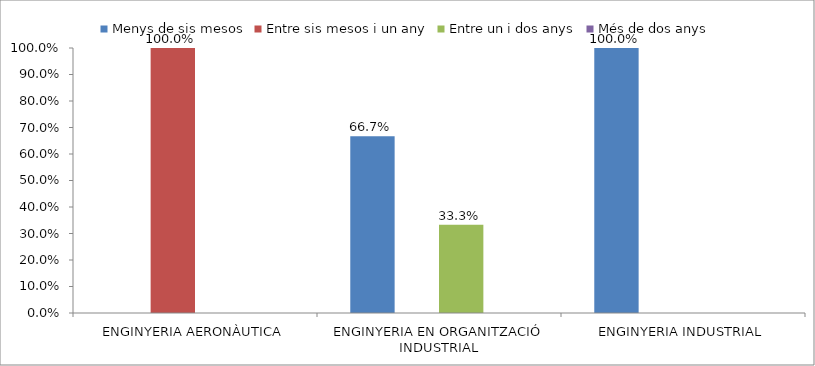
| Category | Menys de sis mesos | Entre sis mesos i un any | Entre un i dos anys | Més de dos anys |
|---|---|---|---|---|
| ENGINYERIA AERONÀUTICA | 0 | 1 | 0 | 0 |
| ENGINYERIA EN ORGANITZACIÓ INDUSTRIAL | 0.667 | 0 | 0.333 | 0 |
| ENGINYERIA INDUSTRIAL | 1 | 0 | 0 | 0 |